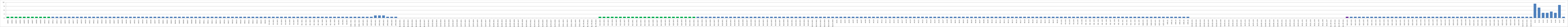
| Category | Series 0 |
|---|---|
| AW01 | 1 |
| AW02 | 1 |
| AW03 | 1 |
| AW04 | 1 |
| AW05 | 1 |
| AW06 | 1 |
| AW07 | 1 |
| AW08 | 1 |
| AW09 | 1 |
| AW10 | 1 |
| AW11 | 1 |
| AW12 | 1 |
| AW13 | 1 |
| AW14 | 1 |
| AW15 | 1 |
| AW16 | 1 |
| AW17 | 1 |
| AW18 | 1 |
| AW19 | 1 |
| AW20 | 1 |
| AW21 | 1 |
| AW22 | 1 |
| AW23 | 1 |
| AW24 | 1 |
| AW25 | 1 |
| AW26 | 1 |
| AW27 | 1 |
| AW28 | 1 |
| AW29 | 1 |
| AW30 | 1 |
| AW31 | 1 |
| AW32 | 1 |
| AW33 | 1 |
| AW34 | 1 |
| AW35 | 1 |
| AW36 | 1 |
| AW37 | 1 |
| AW38 | 1 |
| BW01 | 1 |
| BW02 | 1 |
| BW03 | 1 |
| BWO4 | 1 |
| BW05 | 1 |
| BW06 | 1 |
| BW07 | 1 |
| BW08 | 1 |
| BW09 | 1 |
| BW10 | 1 |
| BW11 | 1 |
| BW12 | 1 |
| BW13 | 1 |
| BW14 | 1 |
| BW15 | 1 |
| BW16 | 1 |
| BW17 | 1 |
| BW18 | 1 |
| BW19 | 1 |
| BW20 | 1 |
| BW21 | 1 |
| BW22 | 1 |
| BW23 | 1 |
| BW24 | 1 |
| BW25 | 1 |
| BW26 | 1 |
| OS.W01 | 1 |
| OS.W02 | 1 |
| OS.W03 | 1 |
| OS.W04 | 1 |
| OS.W05 | 1 |
| OS.W06 | 1 |
| OS.W07 | 1 |
| OS.W08 | 1 |
| OE. W01 | 1 |
| OE. W02 | 1 |
| OE. W03 | 1 |
| OE. W04 | 1 |
| OE. W05 | 1 |
| OE. W06 | 1 |
| OE. W07 | 1 |
| OE. W08 | 1 |
| OE. W09 | 1 |
| OA.W01 | 1 |
| OA.W02 | 1 |
| OA.W03 | 1 |
| OAN. W01 | 1 |
| OAN. W02 | 1 |
| OAN. W03 | 1 |
| OZŚ.W01 | 1 |
| OZŚ.W02 | 1 |
| OZŚ.W03 | 1 |
| OPE.W01 | 2 |
| OPE.W02 | 2 |
| OPE.W03 | 2 |
| OPE.W04 | 1 |
| OPE.W05 | 1 |
| OPE.W06 | 1 |
| B1OD.W01 | 0 |
| B1OD.W02 | 0 |
| B1OD.W03 | 0 |
| B1OD.W04 | 0 |
| B1OD.W05 | 0 |
| B1OD.W06 | 0 |
| B1OD.W07 | 0 |
| B1PZ.W01 | 0 |
| B1PZ.W02 | 0 |
| B1PZ.W03 | 0 |
| B1PZ.W04 | 0 |
| B1PZ.W05 | 0 |
| B1PZ.W06 | 0 |
| B1PZ.W07 | 0 |
| B1PZ.W08 | 0 |
| B1PS.W01 | 0 |
| B1PS.W02 | 0 |
| B1PS.W03 | 0 |
| B1PS.W04 | 0 |
| B1PS.W05 | 0 |
| B1PS.W06 | 0 |
| B1PS.W07 | 0 |
| B1PS.W08 | 0 |
| B1MŚ.W01 | 0 |
| B1MŚ.W02 | 0 |
| B1MŚ.W03 | 0 |
| B1MŚ.W04 | 0 |
| B1MŚ.W05 | 0 |
| B1MŚ.W06 | 0 |
| B1MŚ.W07 | 0 |
| B1MŚ.W08 | 0 |
| B1PO.W01 | 0 |
| B1PO.W02 | 0 |
| B1PO.W03 | 0 |
| B1PO.W04 | 0 |
| B1PO.W05 | 0 |
| B1PO.W06 | 0 |
| B1PO.W07 | 0 |
| B1PO.W08 | 0 |
| B1EL.W01 | 0 |
| B1EL.W02 | 0 |
| B1EL.W03 | 0 |
| B1EL.W04 | 0 |
| B1EL.W05 | 0 |
| B1EL.W06 | 0 |
| B1.PR.W01 | 0 |
| B1.PR.W02 | 0 |
| B1.PR.W03 | 0 |
| B1.PR.W04 | 0 |
| B1S.W01 | 1 |
| B1S.W02 | 1 |
| B1S.W03 | 1 |
| B1S.W04 | 1 |
| B1S.W05 | 1 |
| B1S.W06 | 1 |
| B1S.W07 | 1 |
| B1S.W08 | 1 |
| B2C.W01 | 1 |
| B2C.W02 | 1 |
| B2C.W03 | 1 |
| B2C.W04 | 1 |
| B2C.W05 | 1 |
| B2C.W06 | 1 |
| B2C.W07 | 1 |
| B2C.W08 | 1 |
| B2K.W01 | 1 |
| B2K.W02 | 1 |
| B2K.W03 | 1 |
| B2K.W04 | 1 |
| B2K.W05 | 1 |
| B2K.W06 | 1 |
| B2U.W01 | 1 |
| B2U.W02 | 1 |
| B2U.W03 | 1 |
| B2U.W04 | 1 |
| B2U.W05 | 1 |
| B2U.W06 | 1 |
| B2U.W07 | 1 |
| B2U.W08 | 1 |
| B2N.W01 | 1 |
| B2N.W02 | 1 |
| B2N.W03 | 1 |
| B2N.W04 | 1 |
| B2N.W05 | 1 |
| B2N.W06 | 1 |
| B2N.W07 | 1 |
| B2N.W08 | 1 |
| B2O.W01 | 1 |
| B2O.W02 | 1 |
| B2O.W03 | 1 |
| B2O.W04 | 1 |
| B2O.W05 | 1 |
| B2O.W06 | 1 |
| B2O.W07 | 1 |
| B2O.W08 | 1 |
| B2O.W09 | 1 |
| B2D.W01 | 1 |
| B2D.W02 | 1 |
| B2D.W03 | 1 |
| B2D.W04 | 1 |
| B2D.W05 | 1 |
| B2CH.W01 | 1 |
| B2CH.W02 | 1 |
| B2CH.W03 | 1 |
| B2CH.W04 | 1 |
| B2CH.W05 | 1 |
| B2CH.W06 | 1 |
| AU01 | 1 |
| AU02 | 1 |
| AU03 | 1 |
| AU04 | 1 |
| AU05 | 1 |
| AU06 | 1 |
| AU07 | 1 |
| AU08 | 1 |
| AU09 | 1 |
| AU10 | 1 |
| AU11 | 1 |
| AU12 | 1 |
| AU13 | 1 |
| AU14 | 1 |
| AU15 | 1 |
| AU16 | 1 |
| AU17 | 1 |
| AU18 | 1 |
| AU19 | 1 |
| AU20 | 1 |
| AU21 | 1 |
| AU22 | 1 |
| AU23 | 1 |
| AU24 | 1 |
| AU25 | 1 |
| AU26 | 1 |
| AU27 | 1 |
| AU28 | 1 |
| AU29 | 1 |
| BU01 | 1 |
| BU02 | 1 |
| BU03 | 1 |
| BU04 | 1 |
| BU05 | 1 |
| BU06 | 1 |
| BU07 | 1 |
| BU08 | 1 |
| BU09 | 1 |
| BU10 | 1 |
| BU11 | 1 |
| BU12 | 1 |
| BU13 | 1 |
| BU14 | 1 |
| BU15 | 1 |
| BU16 | 1 |
| BU17 | 1 |
| BU18 | 1 |
| BU19 | 1 |
| BU20 | 1 |
| BU21 | 1 |
| BU22 | 1 |
| BU23 | 1 |
| BU24 | 1 |
| BU25 | 1 |
| BU26 | 1 |
| OS.U01 | 1 |
| OS.U02 | 1 |
| OS.U03 | 1 |
| OS.U04 | 1 |
| OS.U05 | 1 |
| OS.U06 | 1 |
| OE. U01 | 1 |
| OE. U02 | 1 |
| OE. U03 | 1 |
| OE. U04 | 1 |
| OE. U05 | 1 |
| OE. U06 | 1 |
| OE. U07 | 1 |
| OE. U08 | 1 |
| OE. U09 | 1 |
| OA. U01 | 1 |
| OA. U02 | 1 |
| OA. U03 | 1 |
| OA. U04 | 1 |
| OA. U05 | 1 |
| OAN.U01 | 1 |
| OAN.U02 | 1 |
| OAN.U03 | 1 |
| OZŚ.U01 | 1 |
| OZŚ.U02 | 1 |
| OZŚ.U03 | 1 |
| OPE.01 | 1 |
| OPE.02 | 1 |
| OPE.03 | 1 |
| OPE.04 | 1 |
| OPE.05 | 1 |
| OPE.06 | 1 |
| B1OD.U01 | 0 |
| B1OD.U02 | 0 |
| B1OD.U03 | 0 |
| B1OD.U04 | 0 |
| B1OD.U05 | 0 |
| B1OD.U06 | 0 |
| B1OD.U07 | 0 |
| B1OD.U08 | 0 |
| B1PZ.U01 | 0 |
| B1PZ.U02 | 0 |
| B1PZ.U03 | 0 |
| B1PZ.U04 | 0 |
| B1PZ.U05 | 0 |
| B1PS.U01 | 0 |
| B1PS.U02 | 0 |
| B1PS.U03 | 0 |
| B1PS.U04 | 0 |
| B1MŚ.U01 | 0 |
| B1MŚ.U02 | 0 |
| B1MŚ.U03 | 0 |
| B1MŚ.U04 | 0 |
| B1MŚ.U05 | 0 |
| B1PO.U01 | 0 |
| B1PO.U02 | 0 |
| B1PO.U03 | 0 |
| B1PO.U04 | 0 |
| B1PO.U05 | 0 |
| B1EL.U01 | 0 |
| B1EL.U02 | 0 |
| B1EL.U03 | 0 |
| B1EL.U04 | 0 |
| B1EL.U05 | 0 |
| B1EL.U06 | 0 |
| B1EL.U07 | 0 |
| B1.RP.U01 | 0 |
| B1.RP.U02 | 0 |
| B1.RP.U03 | 0 |
| B1.RP.U04 | 0 |
| B2S.U01 | 1 |
| B2S.U02 | 1 |
| B2S.U03 | 1 |
| B2S.U04 | 1 |
| B2S.U05 | 1 |
| B2S.U06 | 1 |
| B2C.U01 | 1 |
| B2C.U02 | 1 |
| B2C.U03 | 1 |
| B2C.U04 | 1 |
| B2C.U05 | 1 |
| B2C.U06 | 1 |
| B2C.U07 | 1 |
| B2K.U01 | 1 |
| B2K.U02 | 1 |
| B2K.U03 | 1 |
| B2K.U04 | 1 |
| B2U.U01 | 1 |
| B2U.U02 | 1 |
| B2U.U03 | 1 |
| B2U.U04 | 1 |
| B2U.U05 | 1 |
| B2U.U06 | 1 |
| B2U.U07 | 1 |
| B2N.U01 | 1 |
| B2N.U02 | 1 |
| B2N.U03 | 1 |
| B2N.U04 | 1 |
| B2N.U05 | 1 |
| B2N.U06 | 1 |
| B2N.U07 | 1 |
| B2O.U01 | 1 |
| B2O.U02 | 1 |
| B2O.U03 | 1 |
| B2O.U04 | 1 |
| B2O.U05 | 1 |
| B2O.U06 | 1 |
| B2O.U07 | 1 |
| B2D.U01 | 1 |
| B2D.U02 | 1 |
| B2D.U03 | 1 |
| B2D.U04 | 1 |
| B2D.U05 | 1 |
| B2CH.U01 | 1 |
| B2CH.U02 | 1 |
| B2CH.U03 | 1 |
| B.K1 | 11 |
| B.K2 | 8 |
| B.K3 | 4 |
| B.K4 | 4 |
| B.K5 | 5 |
| B.K6 | 4 |
| B.K7 | 10 |
| B.K8 | 1 |